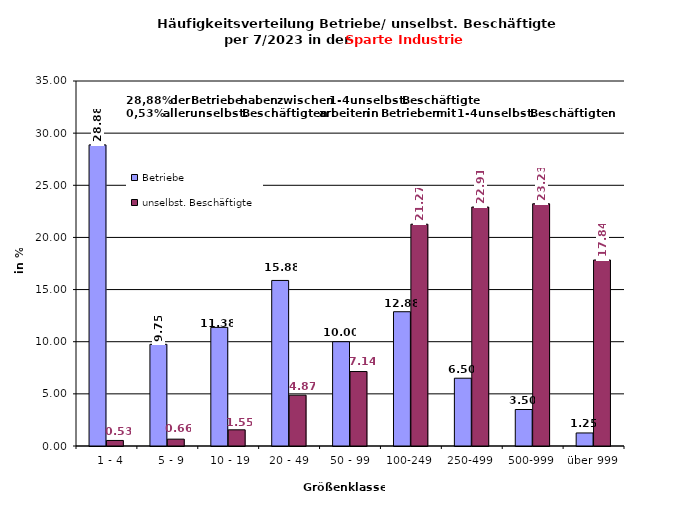
| Category | Betriebe | unselbst. Beschäftigte |
|---|---|---|
|   1 - 4 | 28.875 | 0.531 |
|   5 - 9 | 9.75 | 0.657 |
|  10 - 19 | 11.375 | 1.551 |
| 20 - 49 | 15.875 | 4.874 |
| 50 - 99 | 10 | 7.14 |
| 100-249 | 12.875 | 21.268 |
| 250-499 | 6.5 | 22.915 |
| 500-999 | 3.5 | 23.228 |
| über 999 | 1.25 | 17.837 |